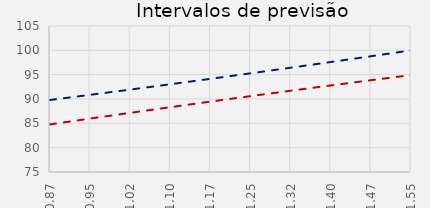
| Category | Series 0 | Series 2 |
|---|---|---|
| 0.87 | 89.795 | 84.781 |
| 0.9455555555555556 | 90.857 | 85.977 |
| 1.021111111111111 | 91.935 | 87.158 |
| 1.0966666666666667 | 93.031 | 88.321 |
| 1.1722222222222223 | 94.145 | 89.465 |
| 1.2477777777777779 | 95.278 | 90.591 |
| 1.3233333333333335 | 96.429 | 91.698 |
| 1.398888888888889 | 97.599 | 92.788 |
| 1.4744444444444447 | 98.785 | 93.86 |
| 1.55 | 99.988 | 94.916 |